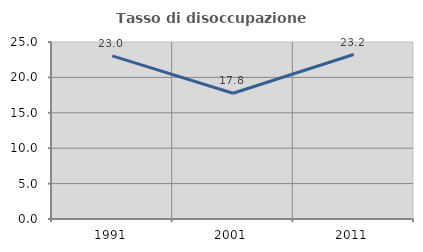
| Category | Tasso di disoccupazione giovanile  |
|---|---|
| 1991.0 | 23.039 |
| 2001.0 | 17.757 |
| 2011.0 | 23.232 |